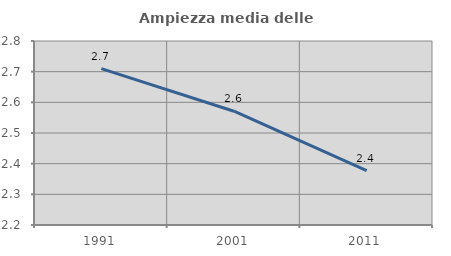
| Category | Ampiezza media delle famiglie |
|---|---|
| 1991.0 | 2.71 |
| 2001.0 | 2.571 |
| 2011.0 | 2.377 |